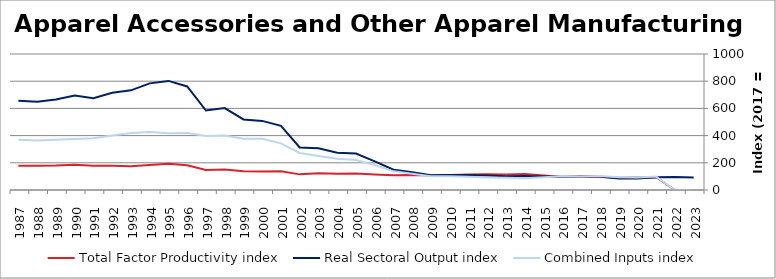
| Category | Total Factor Productivity index | Real Sectoral Output index | Combined Inputs index |
|---|---|---|---|
| 2023.0 | 0 | 91.809 | 0 |
| 2022.0 | 0 | 95.472 | 0 |
| 2021.0 | 94.426 | 92.884 | 98.368 |
| 2020.0 | 92.676 | 85.376 | 92.123 |
| 2019.0 | 89.35 | 84.02 | 94.034 |
| 2018.0 | 95.538 | 98.762 | 103.374 |
| 2017.0 | 100 | 100 | 100 |
| 2016.0 | 95.849 | 96.969 | 101.168 |
| 2015.0 | 106.623 | 100.034 | 93.82 |
| 2014.0 | 117.543 | 102.387 | 87.106 |
| 2013.0 | 113.646 | 101.38 | 89.207 |
| 2012.0 | 115.124 | 105.977 | 92.055 |
| 2011.0 | 113.621 | 109.724 | 96.57 |
| 2010.0 | 110.502 | 110.817 | 100.285 |
| 2009.0 | 107.11 | 107.711 | 100.56 |
| 2008.0 | 109.655 | 130.22 | 118.753 |
| 2007.0 | 108.432 | 148.716 | 137.152 |
| 2006.0 | 114.398 | 210.18 | 183.727 |
| 2005.0 | 121.528 | 267.997 | 220.522 |
| 2004.0 | 118.721 | 273.492 | 230.365 |
| 2003.0 | 122.305 | 306.443 | 250.557 |
| 2002.0 | 114.946 | 312.947 | 272.257 |
| 2001.0 | 137.53 | 471.888 | 343.116 |
| 2000.0 | 135.13 | 508.067 | 375.985 |
| 1999.0 | 137.402 | 518.759 | 377.549 |
| 1998.0 | 150.351 | 602.257 | 400.567 |
| 1997.0 | 147.159 | 584.406 | 397.126 |
| 1996.0 | 181.709 | 761.475 | 419.062 |
| 1995.0 | 192.26 | 802.14 | 417.216 |
| 1994.0 | 184.105 | 784.094 | 425.894 |
| 1993.0 | 174.947 | 732.81 | 418.875 |
| 1992.0 | 178.347 | 715.693 | 401.293 |
| 1991.0 | 177.65 | 675.324 | 380.143 |
| 1990.0 | 185.549 | 694.151 | 374.106 |
| 1989.0 | 179.769 | 665.164 | 370.01 |
| 1988.0 | 178.226 | 649.742 | 364.561 |
| 1987.0 | 177.729 | 656.09 | 369.152 |